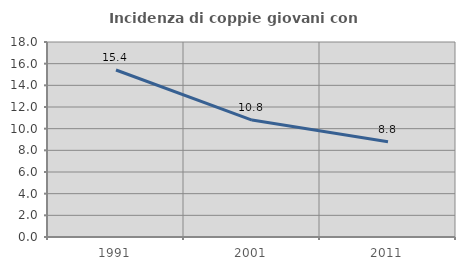
| Category | Incidenza di coppie giovani con figli |
|---|---|
| 1991.0 | 15.418 |
| 2001.0 | 10.794 |
| 2011.0 | 8.8 |